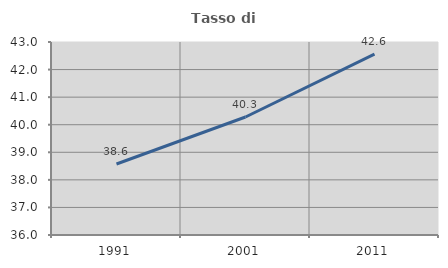
| Category | Tasso di occupazione   |
|---|---|
| 1991.0 | 38.576 |
| 2001.0 | 40.28 |
| 2011.0 | 42.559 |